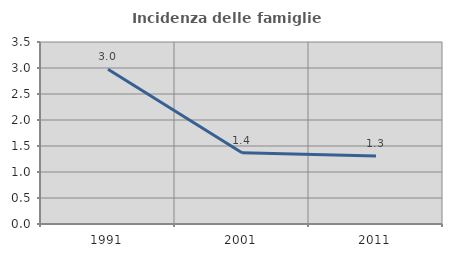
| Category | Incidenza delle famiglie numerose |
|---|---|
| 1991.0 | 2.976 |
| 2001.0 | 1.368 |
| 2011.0 | 1.308 |